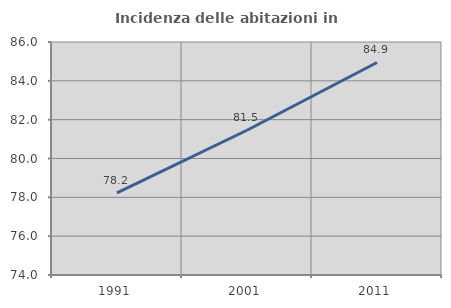
| Category | Incidenza delle abitazioni in proprietà  |
|---|---|
| 1991.0 | 78.226 |
| 2001.0 | 81.455 |
| 2011.0 | 84.945 |